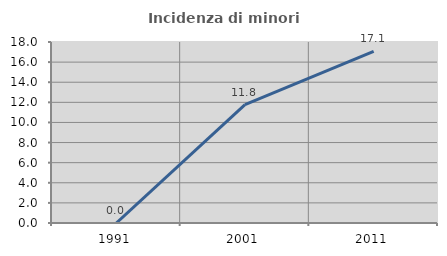
| Category | Incidenza di minori stranieri |
|---|---|
| 1991.0 | 0 |
| 2001.0 | 11.765 |
| 2011.0 | 17.073 |